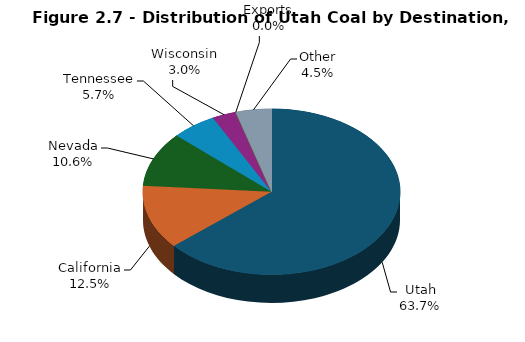
| Category | Series 0 |
|---|---|
| Utah | 15575 |
| California | 3049 |
| Nevada | 2603 |
| Tennessee | 1386 |
| Wisconsin | 743 |
| Exports | 0 |
| Other | 1096 |